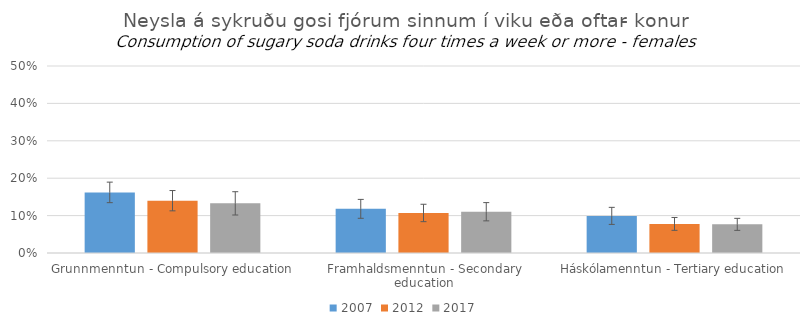
| Category | 2007 | 2012 | 2017 |
|---|---|---|---|
| Grunnmenntun - Compulsory education | 0.162 | 0.14 | 0.133 |
| Framhaldsmenntun - Secondary education | 0.118 | 0.107 | 0.11 |
| Háskólamenntun - Tertiary education | 0.099 | 0.078 | 0.077 |